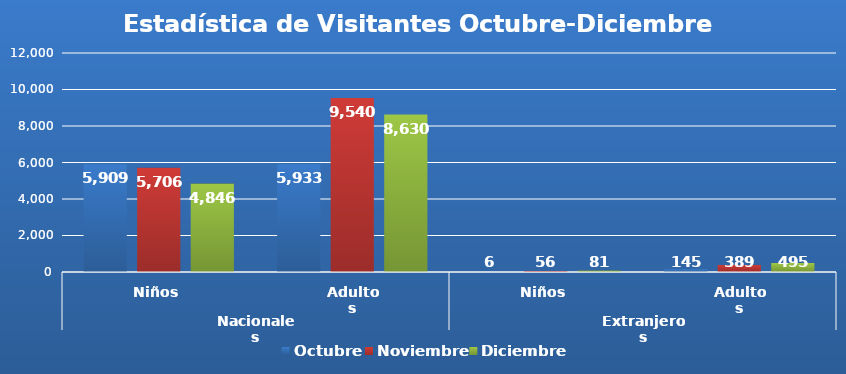
| Category | Octubre | Noviembre | Diciembre |
|---|---|---|---|
| 0 | 5909 | 5706 | 4846 |
| 1 | 5933 | 9540 | 8630 |
| 2 | 6 | 56 | 81 |
| 3 | 145 | 389 | 495 |